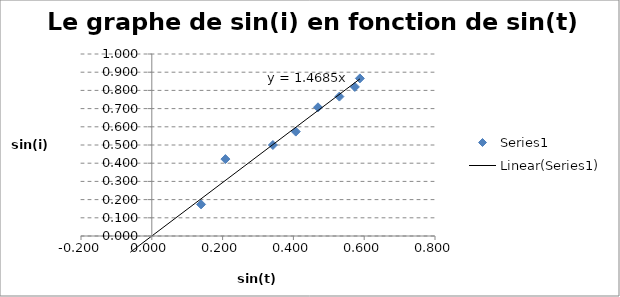
| Category | Series 0 |
|---|---|
| 0.4694715627858908 | 0.707 |
| 0.3420201433256687 | 0.5 |
| 0.5877852522924731 | 0.866 |
| 0.13917310096006544 | 0.174 |
| 0.20791169081775931 | 0.423 |
| 0.5299192642332049 | 0.766 |
| 0.40673664307580015 | 0.574 |
| 0.573576436351046 | 0.819 |